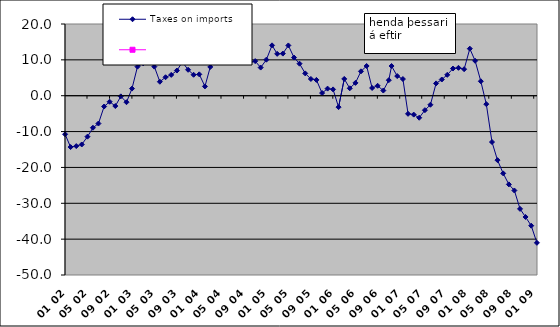
| Category | Taxes on imports | Series 1 |
|---|---|---|
| 2002-01-15 06:00:00 | -10.75 |  |
| 2002-02-14 16:30:00 | -14.32 |  |
| 2002-03-17 03:00:00 | -14.05 |  |
| 2002-04-16 13:30:00 | -13.6 |  |
| 2002-05-17 | -11.42 |  |
| 2002-06-16 10:30:00 | -8.93 |  |
| 2002-07-16 21:00:00 | -7.76 |  |
| 2002-08-16 07:30:00 | -3.01 |  |
| 2002-09-15 18:00:00 | -1.68 |  |
| 2002-10-16 04:30:00 | -2.88 |  |
| 2002-11-15 15:00:00 | -0.18 |  |
| 2002-12-16 01:30:00 | -1.81 |  |
| 2003-01-15 12:00:00 | 1.99 |  |
| 2003-02-14 22:30:00 | 8.11 |  |
| 2003-03-17 09:00:00 | 9.03 |  |
| 2003-04-16 19:30:00 | 12.23 |  |
| 2003-05-17 06:00:00 | 8.11 |  |
| 2003-06-16 16:30:00 | 3.9 |  |
| 2003-07-17 03:00:00 | 5.15 |  |
| 2003-08-17 | 5.81 |  |
| 2003-09-17 | 7.02 |  |
| 2003-10-17 | 9.4 |  |
| 2003-11-17 | 7.23 |  |
| 2003-12-17 | 5.84 |  |
| 2004-01-17 | 5.96 |  |
| 2004-02-17 | 2.6 |  |
| 2004-03-17 | 8.02 |  |
| 2004-04-17 | 10.78 |  |
| 2004-05-17 | 11.01 |  |
| 2004-06-17 | 16.65 |  |
| 2004-07-17 | 13.33 |  |
| 2004-08-17 | 13.18 |  |
| 2004-09-17 | 11.29 |  |
| 2004-10-17 | 9.29 |  |
| 2004-11-17 | 9.65 |  |
| 2004-12-17 | 7.85 |  |
| 2005-01-17 | 10.05 |  |
| 2005-02-17 | 14.05 |  |
| 2005-03-17 | 11.68 |  |
| 2005-04-17 | 11.75 |  |
| 2005-05-17 | 14.02 |  |
| 2005-06-17 | 10.64 |  |
| 2005-07-17 | 8.93 |  |
| 2005-08-17 | 6.23 |  |
| 2005-09-17 | 4.67 |  |
| 2005-10-17 | 4.41 |  |
| 2005-11-17 | 0.74 |  |
| 2005-12-17 | 1.98 |  |
| 2006-01-16 10:30:00 | 1.76 |  |
| 2006-02-15 21:00:00 | -3.19 |  |
| 2006-03-18 07:30:00 | 4.68 |  |
| 2006-04-17 18:00:00 | 2.07 |  |
| 2006-05-18 04:30:00 | 3.58 |  |
| 2006-06-17 15:00:00 | 6.8 |  |
| 2006-07-18 01:30:00 | 8.29 |  |
| 2006-08-17 12:00:00 | 2.16 |  |
| 2006-09-16 22:30:00 | 2.77 |  |
| 2006-10-17 09:00:00 | 1.44 |  |
| 2006-11-16 19:30:00 | 4.33 |  |
| 2006-12-01 | 8.28 |  |
| 2007-01-01 | 5.48 |  |
| 2007-02-01 | 4.65 |  |
| 2007-03-01 | -5.05 |  |
| 2007-04-01 | -5.27 |  |
| 2007-05-01 | -6.14 |  |
| 2007-06-01 | -4.03 |  |
| 2007-07-01 | -2.52 |  |
| 2007-08-01 | 3.44 |  |
| 2007-09-01 | 4.52 |  |
| 2007-10-01 | 5.83 |  |
| 2007-11-01 | 7.58 |  |
| 2007-12-01 | 7.78 |  |
| 2008-01-01 | 7.4 |  |
| 2008-02-01 | 13.12 |  |
| 2008-03-01 | 9.73 |  |
| 2008-04-01 | 4.03 |  |
| 2008-05-01 | -2.35 |  |
| 2008-06-01 | -12.91 |  |
| 2008-07-01 | -17.97 |  |
| 2008-08-01 | -21.66 |  |
| 2008-09-01 | -24.73 |  |
| 2008-10-01 | -26.43 |  |
| 2008-11-01 | -31.56 |  |
| 2008-12-01 | -33.82 |  |
| 2009-01-01 | -36.25 |  |
| 2009-02-01 | -41.03 |  |